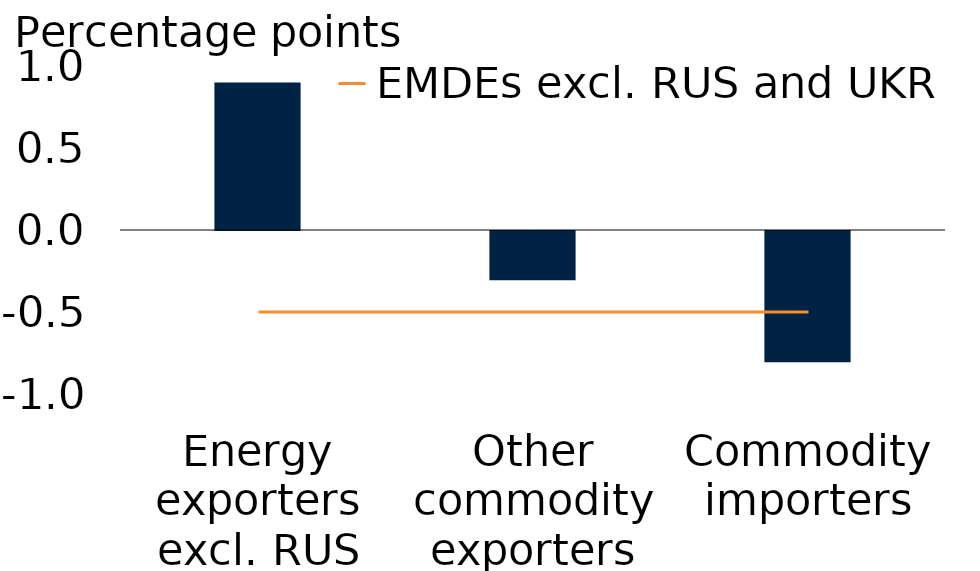
| Category | Forecast change |
|---|---|
| Energy exporters excl. RUS | 0.9 |
| Other commodity exporters excl. UKR | -0.3 |
| Commodity importers | -0.8 |